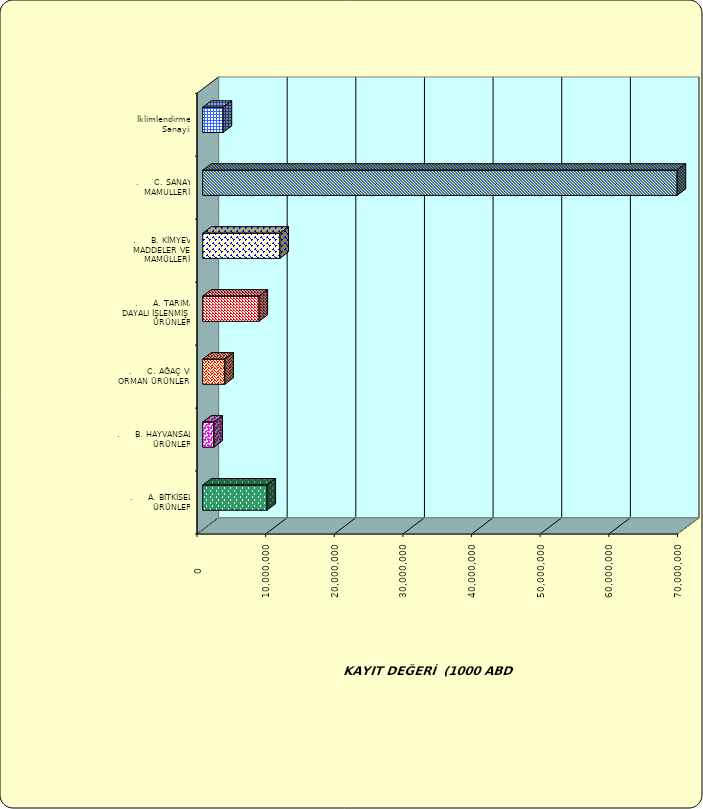
| Category | Series 0 |
|---|---|
| .     A. BİTKİSEL ÜRÜNLER | 9363830.274 |
| .     B. HAYVANSAL ÜRÜNLER | 1626148.517 |
| .     C. AĞAÇ VE ORMAN ÜRÜNLERİ | 3222863.615 |
| .     A. TARIMA DAYALI İŞLENMİŞ ÜRÜNLER | 8205242.476 |
| .     B. KİMYEVİ MADDELER VE MAMÜLLERİ | 11250100.571 |
| .     C. SANAYİ MAMULLERİ | 69120182.025 |
|  İklimlendirme Sanayii | 2975833.627 |